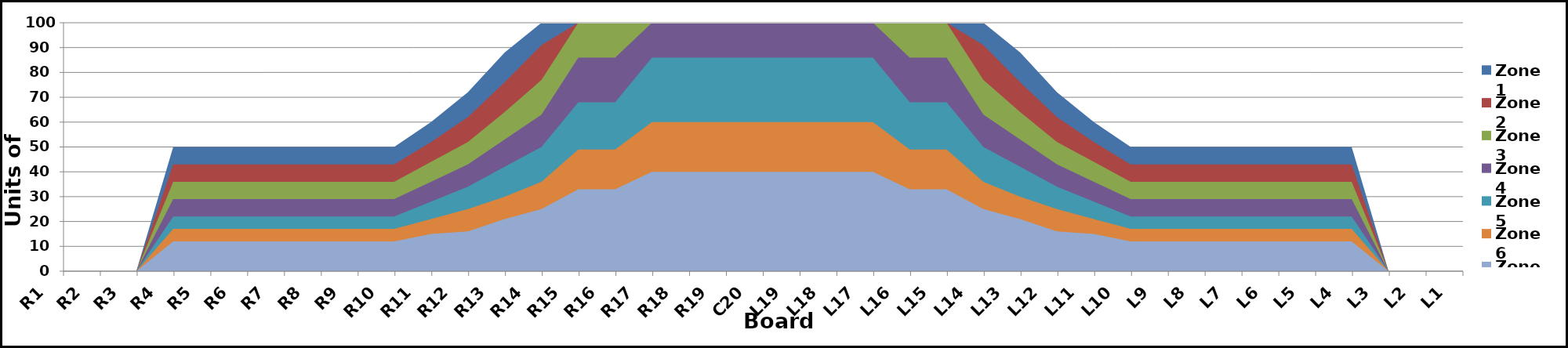
| Category | Zone 1 | Zone 2 | Zone 3 | Zone 4 | Zone 5 | Zone 6 | Zone 7 | Zone 8 |
|---|---|---|---|---|---|---|---|---|
| L1 | 0 | 0 | 0 | 0 | 0 | 0 | 0 | 0 |
| L2 | 0 | 0 | 0 | 0 | 0 | 0 | 0 | 0 |
| L3 | 0 | 0 | 0 | 0 | 0 | 0 | 0 | 0 |
| L4 | 50 | 43 | 36 | 29 | 22 | 17 | 12 | 0 |
| L5 | 50 | 43 | 36 | 29 | 22 | 17 | 12 | 0 |
| L6 | 50 | 43 | 36 | 29 | 22 | 17 | 12 | 0 |
| L7 | 50 | 43 | 36 | 29 | 22 | 17 | 12 | 0 |
| L8 | 50 | 43 | 36 | 29 | 22 | 17 | 12 | 0 |
| L9 | 50 | 43 | 36 | 29 | 22 | 17 | 12 | 0 |
| L10 | 50 | 43 | 36 | 29 | 22 | 17 | 12 | 0 |
| L11 | 60 | 52 | 44 | 36 | 28 | 21 | 15 | 0 |
| L12 | 72 | 62 | 52 | 43 | 34 | 25 | 16 | 0 |
| L13 | 88 | 76 | 64 | 53 | 42 | 30 | 21 | 0 |
| L14 | 100 | 91 | 77 | 63 | 50 | 36 | 25 | 0 |
| L15 | 100 | 100 | 100 | 86 | 68 | 49 | 33 | 0 |
| L16 | 100 | 100 | 100 | 86 | 68 | 49 | 33 | 0 |
| L17 | 100 | 100 | 100 | 100 | 86 | 60 | 40 | 0 |
| L18 | 100 | 100 | 100 | 100 | 86 | 60 | 40 | 0 |
| L19 | 100 | 100 | 100 | 100 | 86 | 60 | 40 | 0 |
| C20 | 100 | 100 | 100 | 100 | 86 | 60 | 40 | 0 |
| R19 | 100 | 100 | 100 | 100 | 86 | 60 | 40 | 0 |
| R18 | 100 | 100 | 100 | 100 | 86 | 60 | 40 | 0 |
| R17 | 100 | 100 | 100 | 100 | 86 | 60 | 40 | 0 |
| R16 | 100 | 100 | 100 | 86 | 68 | 49 | 33 | 0 |
| R15 | 100 | 100 | 100 | 86 | 68 | 49 | 33 | 0 |
| R14 | 100 | 91 | 77 | 63 | 50 | 36 | 25 | 0 |
| R13 | 88 | 76 | 64 | 53 | 42 | 30 | 21 | 0 |
| R12 | 72 | 62 | 52 | 43 | 34 | 25 | 16 | 0 |
| R11 | 60 | 52 | 44 | 36 | 28 | 21 | 15 | 0 |
| R10 | 50 | 43 | 36 | 29 | 22 | 17 | 12 | 0 |
| R9 | 50 | 43 | 36 | 29 | 22 | 17 | 12 | 0 |
| R8 | 50 | 43 | 36 | 29 | 22 | 17 | 12 | 0 |
| R7 | 50 | 43 | 36 | 29 | 22 | 17 | 12 | 0 |
| R6 | 50 | 43 | 36 | 29 | 22 | 17 | 12 | 0 |
| R5 | 50 | 43 | 36 | 29 | 22 | 17 | 12 | 0 |
| R4 | 50 | 43 | 36 | 29 | 22 | 17 | 12 | 0 |
| R3 | 0 | 0 | 0 | 0 | 0 | 0 | 0 | 0 |
| R2 | 0 | 0 | 0 | 0 | 0 | 0 | 0 | 0 |
| R1 | 0 | 0 | 0 | 0 | 0 | 0 | 0 | 0 |